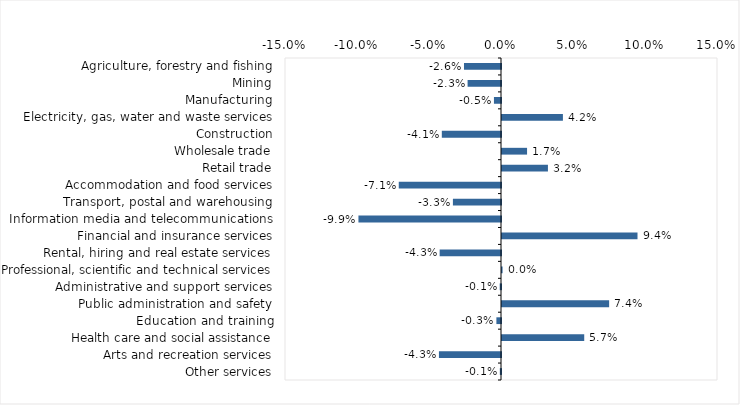
| Category | This week |
|---|---|
| Agriculture, forestry and fishing | -0.026 |
| Mining | -0.023 |
| Manufacturing | -0.005 |
| Electricity, gas, water and waste services | 0.042 |
| Construction | -0.041 |
| Wholesale trade | 0.017 |
| Retail trade | 0.032 |
| Accommodation and food services | -0.071 |
| Transport, postal and warehousing | -0.033 |
| Information media and telecommunications | -0.099 |
| Financial and insurance services | 0.094 |
| Rental, hiring and real estate services | -0.043 |
| Professional, scientific and technical services | 0 |
| Administrative and support services | -0.001 |
| Public administration and safety | 0.074 |
| Education and training | -0.003 |
| Health care and social assistance | 0.057 |
| Arts and recreation services | -0.043 |
| Other services | -0.001 |